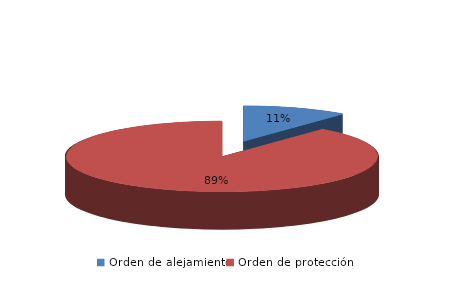
| Category | Series 0 |
|---|---|
| Orden de alejamiento | 24 |
| Orden de protección | 196 |